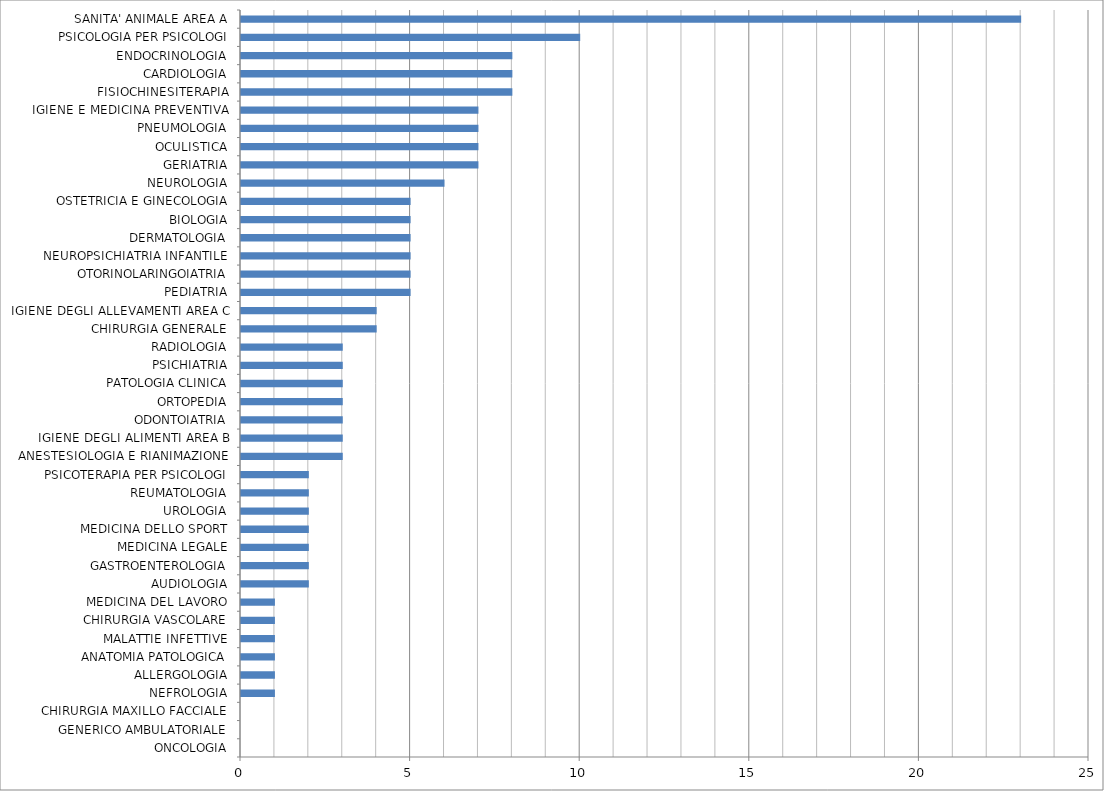
| Category | Series 0 |
|---|---|
| ONCOLOGIA | 0 |
| GENERICO AMBULATORIALE | 0 |
| CHIRURGIA MAXILLO FACCIALE | 0 |
| NEFROLOGIA | 1 |
| ALLERGOLOGIA | 1 |
| ANATOMIA PATOLOGICA | 1 |
| MALATTIE INFETTIVE | 1 |
| CHIRURGIA VASCOLARE | 1 |
| MEDICINA DEL LAVORO | 1 |
| AUDIOLOGIA | 2 |
| GASTROENTEROLOGIA | 2 |
| MEDICINA LEGALE | 2 |
| MEDICINA DELLO SPORT | 2 |
| UROLOGIA | 2 |
| REUMATOLOGIA | 2 |
| PSICOTERAPIA PER PSICOLOGI | 2 |
| ANESTESIOLOGIA E RIANIMAZIONE | 3 |
| IGIENE DEGLI ALIMENTI AREA B | 3 |
| ODONTOIATRIA | 3 |
| ORTOPEDIA | 3 |
| PATOLOGIA CLINICA | 3 |
| PSICHIATRIA | 3 |
| RADIOLOGIA | 3 |
| CHIRURGIA GENERALE | 4 |
| IGIENE DEGLI ALLEVAMENTI AREA C | 4 |
| PEDIATRIA | 5 |
| OTORINOLARINGOIATRIA | 5 |
| NEUROPSICHIATRIA INFANTILE | 5 |
| DERMATOLOGIA | 5 |
| BIOLOGIA | 5 |
| OSTETRICIA E GINECOLOGIA | 5 |
| NEUROLOGIA | 6 |
| GERIATRIA | 7 |
| OCULISTICA | 7 |
| PNEUMOLOGIA | 7 |
| IGIENE E MEDICINA PREVENTIVA | 7 |
| FISIOCHINESITERAPIA | 8 |
| CARDIOLOGIA | 8 |
| ENDOCRINOLOGIA | 8 |
| PSICOLOGIA PER PSICOLOGI | 10 |
| SANITA' ANIMALE AREA A | 23 |